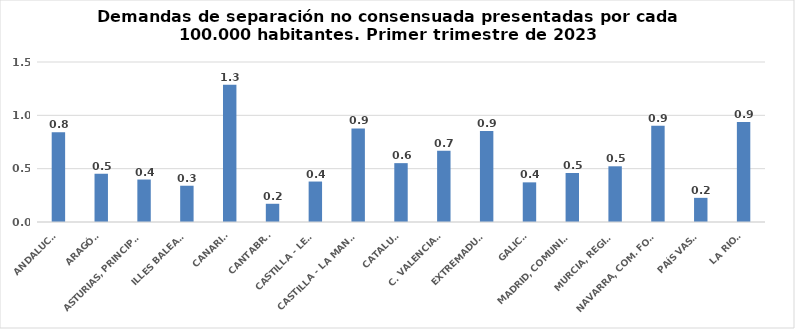
| Category | Series 0 |
|---|---|
| ANDALUCÍA | 0.842 |
| ARAGÓN | 0.452 |
| ASTURIAS, PRINCIPADO | 0.398 |
| ILLES BALEARS | 0.34 |
| CANARIAS | 1.286 |
| CANTABRIA | 0.171 |
| CASTILLA - LEÓN | 0.379 |
| CASTILLA - LA MANCHA | 0.877 |
| CATALUÑA | 0.552 |
| C. VALENCIANA | 0.667 |
| EXTREMADURA | 0.853 |
| GALICIA | 0.372 |
| MADRID, COMUNIDAD | 0.459 |
| MURCIA, REGIÓN | 0.522 |
| NAVARRA, COM. FORAL | 0.903 |
| PAÍS VASCO | 0.226 |
| LA RIOJA | 0.938 |